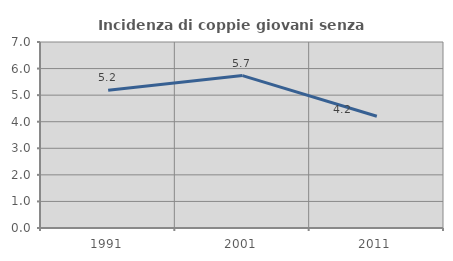
| Category | Incidenza di coppie giovani senza figli |
|---|---|
| 1991.0 | 5.183 |
| 2001.0 | 5.736 |
| 2011.0 | 4.206 |